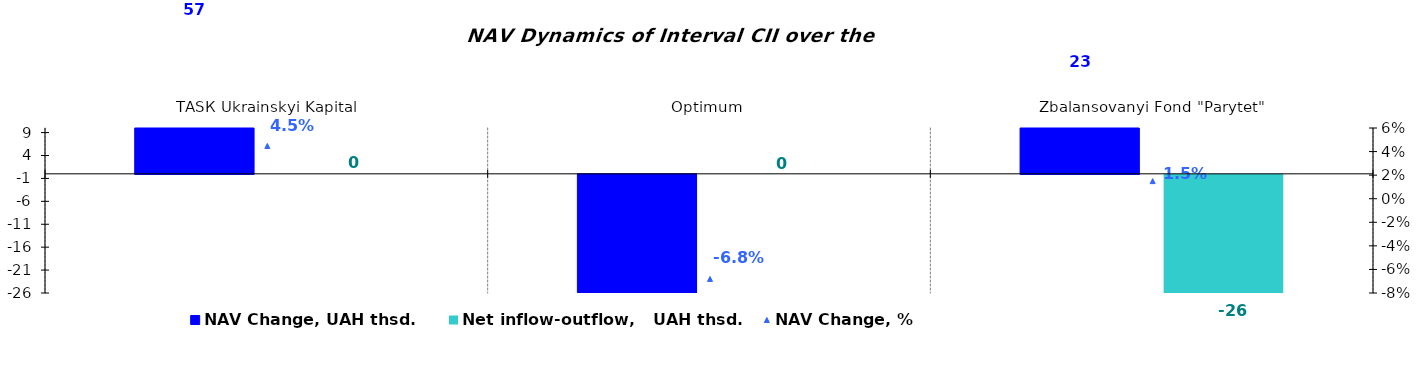
| Category | NAV Change, UAH thsd. | Net inflow-outflow,   UAH thsd. |
|---|---|---|
| ТАSК Ukrainskyi Kapital | 57.153 | 0 |
| Оptimum | -28.223 | 0 |
| Zbalansovanyi Fond "Parytet" | 22.923 | -26.248 |